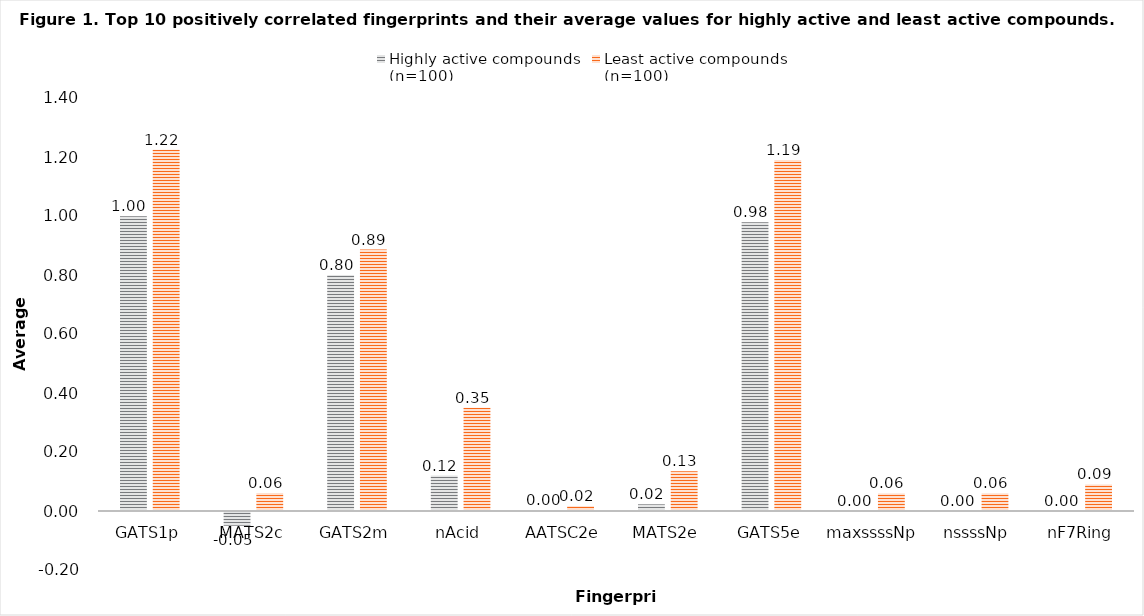
| Category | Highly active compounds 
(n=100) | Least active compounds 
(n=100) |
|---|---|---|
| GATS1p | 0.999 | 1.225 |
| MATS2c | -0.047 | 0.061 |
| GATS2m | 0.8 | 0.886 |
| nAcid | 0.12 | 0.35 |
| AATSC2e | 0.003 | 0.017 |
| MATS2e | 0.023 | 0.134 |
| GATS5e | 0.979 | 1.19 |
| maxssssNp | 0 | 0.06 |
| nssssNp | 0 | 0.06 |
| nF7Ring | 0 | 0.09 |